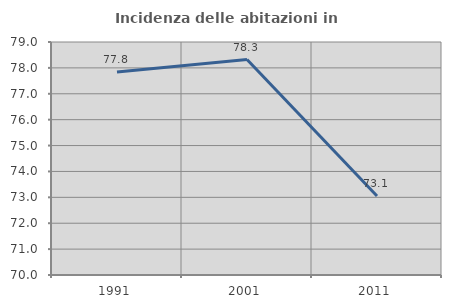
| Category | Incidenza delle abitazioni in proprietà  |
|---|---|
| 1991.0 | 77.846 |
| 2001.0 | 78.324 |
| 2011.0 | 73.051 |